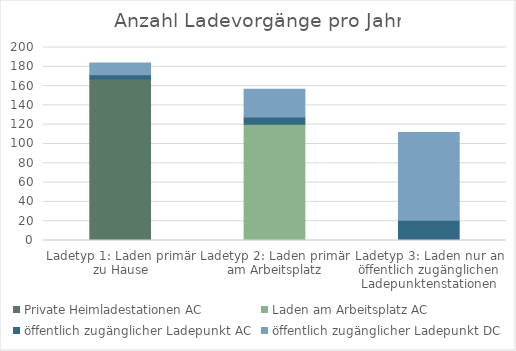
| Category | Private Heimladestationen AC | Laden am Arbeitsplatz AC | öffentlich zugänglicher Ladepunkt AC | öffentlich zugänglicher Ladepunkt DC |
|---|---|---|---|---|
| Ladetyp 1: Laden primär zu Hause | 167.413 | 0 | 4.405 | 12.002 |
| Ladetyp 2: Laden primär am Arbeitsplatz | 0 | 120.36 | 7.709 | 28.59 |
| Ladetyp 3: Laden nur an öffentlich zugänglichen Ladepunktenstationen | 0 | 0 | 20.925 | 90.894 |